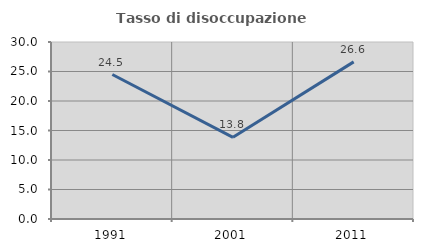
| Category | Tasso di disoccupazione giovanile  |
|---|---|
| 1991.0 | 24.49 |
| 2001.0 | 13.846 |
| 2011.0 | 26.633 |